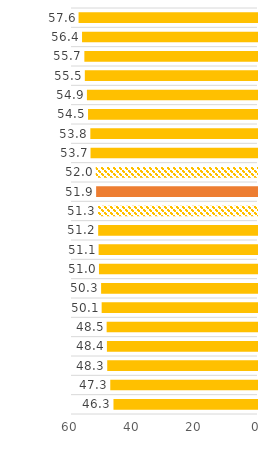
| Category | Soutien à l’égalité des sexes (% d'élèves) |
|---|---|
| Bulgarie | 46.3 |
| Serbie | 47.33 |
| Lettonie | 48.315 |
| Colombie | 48.418 |
| République slovaque | 48.504 |
| Roumanie | 50.113 |
| Slovénie | 50.287 |
| Chypre | 50.979 |
| Pologne | 51.089 |
| Lituanie | 51.233 |
| Estonie | 51.307 |
| Moyenne ICCS | 51.898 |
| Pays-Bas | 52.027 |
| Croatie | 53.7 |
| Malte | 53.757 |
| Espagne | 54.502 |
| Norvège | 54.867 |
| France | 55.54 |
| Italie | 55.689 |
| Suède | 56.438 |
| Taipei chinois | 57.559 |